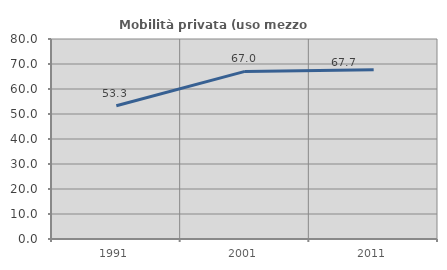
| Category | Mobilità privata (uso mezzo privato) |
|---|---|
| 1991.0 | 53.273 |
| 2001.0 | 67.037 |
| 2011.0 | 67.705 |